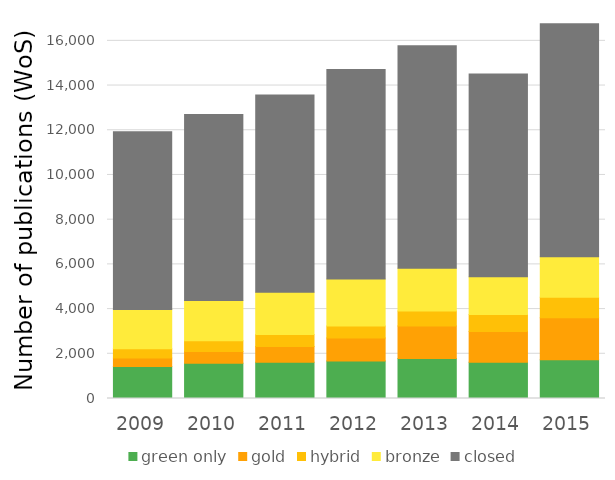
| Category | green only | gold | hybrid | bronze | closed |
|---|---|---|---|---|---|
| 2009.0 | 1427 | 381 | 417 | 1757 | 7949 |
| 2010.0 | 1579 | 527 | 483 | 1792 | 8322 |
| 2011.0 | 1621 | 705 | 541 | 1886 | 8825 |
| 2012.0 | 1679 | 1031 | 539 | 2092 | 9375 |
| 2013.0 | 1794 | 1455 | 660 | 1916 | 9959 |
| 2014.0 | 1627 | 1370 | 759 | 1686 | 9080 |
| 2015.0 | 1736 | 1882 | 915 | 1810 | 10423 |